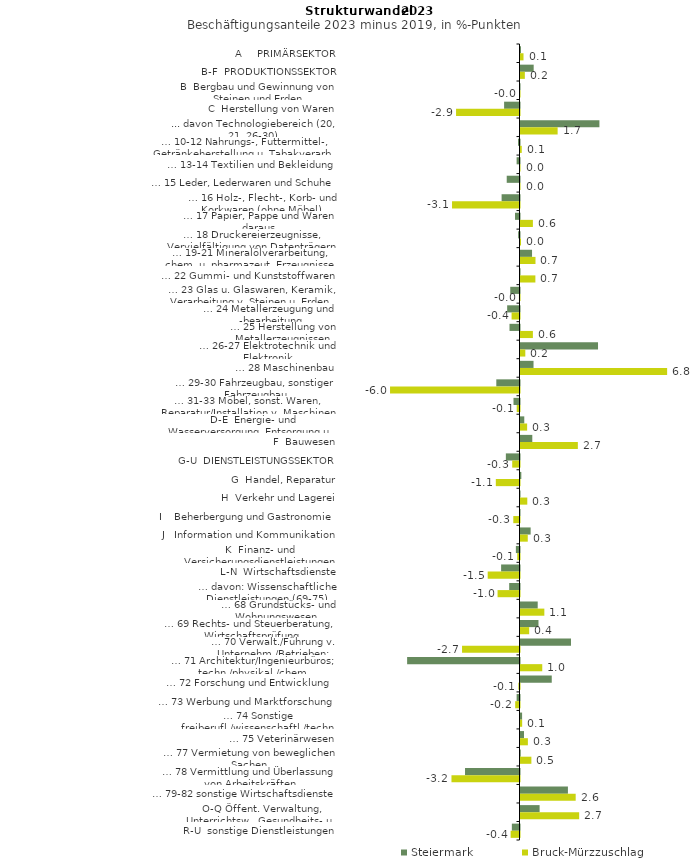
| Category | Steiermark | Bruck-Mürzzuschlag |
|---|---|---|
| A     PRIMÄRSEKTOR | 0.022 | 0.139 |
| B-F  PRODUKTIONSSEKTOR | 0.612 | 0.202 |
| B  Bergbau und Gewinnung von Steinen und Erden | -0.009 | -0.019 |
| C  Herstellung von Waren | -0.714 | -2.943 |
| ... davon Technologiebereich (20, 21, 26-30) | 3.66 | 1.722 |
| … 10-12 Nahrungs-, Futtermittel-, Getränkeherstellung u. Tabakverarb. | -0.068 | 0.058 |
| … 13-14 Textilien und Bekleidung | -0.134 | 0 |
| … 15 Leder, Lederwaren und Schuhe | -0.593 | 0 |
| … 16 Holz-, Flecht-, Korb- und Korkwaren (ohne Möbel)  | -0.83 | -3.129 |
| … 17 Papier, Pappe und Waren daraus  | -0.208 | 0.575 |
| … 18 Druckereierzeugnisse, Vervielfältigung von Datenträgern | -0.063 | 0.023 |
| … 19-21 Mineralölverarbeitung, chem. u. pharmazeut. Erzeugnisse | 0.535 | 0.695 |
| … 22 Gummi- und Kunststoffwaren | -0.02 | 0.69 |
| … 23 Glas u. Glaswaren, Keramik, Verarbeitung v. Steinen u. Erden  | -0.429 | -0.027 |
| … 24 Metallerzeugung und -bearbeitung | -0.572 | -0.367 |
| … 25 Herstellung von Metallerzeugnissen  | -0.464 | 0.575 |
| … 26-27 Elektrotechnik und Elektronik | 3.595 | 0.223 |
| … 28 Maschinenbau | 0.604 | 6.8 |
| … 29-30 Fahrzeugbau, sonstiger Fahrzeugbau | -1.076 | -6.004 |
| … 31-33 Möbel, sonst. Waren, Reparatur/Installation v. Maschinen | -0.279 | -0.129 |
| D-E  Energie- und Wasserversorgung, Entsorgung u. Rückgewinnung | 0.175 | 0.308 |
| F  Bauwesen | 0.547 | 2.66 |
| G-U  DIENSTLEISTUNGSSEKTOR | -0.633 | -0.338 |
| G  Handel, Reparatur | 0.038 | -1.098 |
| H  Verkehr und Lagerei | -0.011 | 0.315 |
| I    Beherbergung und Gastronomie | -0.007 | -0.288 |
| J   Information und Kommunikation | 0.471 | 0.337 |
| K  Finanz- und Versicherungsdienstleistungen | -0.168 | -0.105 |
| L-N  Wirtschaftsdienste | -0.853 | -1.475 |
| … davon: Wissenschaftliche Dienstleistungen (69-75) | -0.478 | -1.018 |
| … 68 Grundstücks- und Wohnungswesen  | 0.798 | 1.106 |
| … 69 Rechts- und Steuerberatung, Wirtschaftsprüfung | 0.834 | 0.403 |
| … 70 Verwalt./Führung v. Unternehm./Betrieben; Unternehmensberat. | 2.342 | -2.665 |
| … 71 Architektur/Ingenieurbüros; techn./physikal./chem. Untersuchung | -5.212 | 1.009 |
| … 72 Forschung und Entwicklung  | 1.449 | -0.051 |
| … 73 Werbung und Marktforschung | -0.133 | -0.2 |
| … 74 Sonstige freiberufl./wissenschaftl./techn. Tätigkeiten | 0.074 | 0.077 |
| … 75 Veterinärwesen | 0.163 | 0.342 |
| … 77 Vermietung von beweglichen Sachen  | 0.011 | 0.505 |
| … 78 Vermittlung und Überlassung von Arbeitskräften | -2.527 | -3.155 |
| … 79-82 sonstige Wirtschaftsdienste | 2.199 | 2.559 |
| O-Q Öffent. Verwaltung, Unterrichtsw., Gesundheits- u. Sozialwesen | 0.886 | 2.721 |
| R-U  sonstige Dienstleistungen | -0.355 | -0.411 |